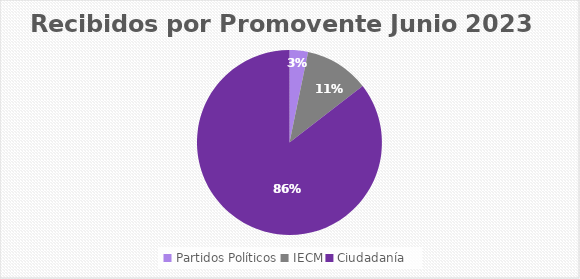
| Category | Recibidos por Promovente JUNIO |
|---|---|
| Partidos Políticos | 2 |
| IECM | 7 |
| Ciudadanía  | 53 |